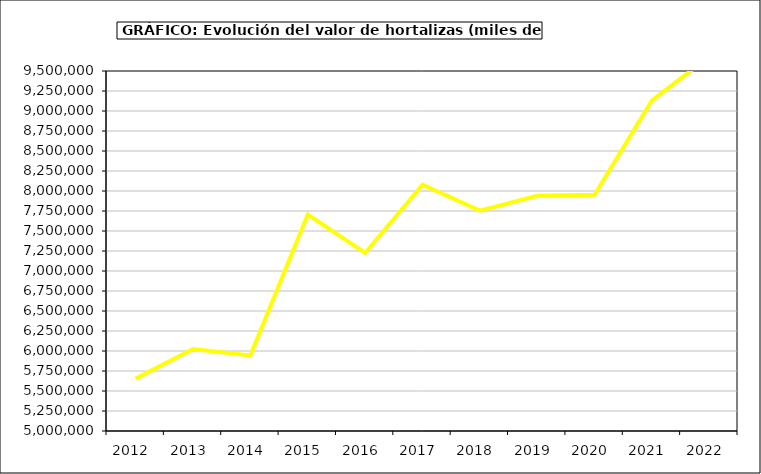
| Category | Valor |
|---|---|
| 2012.0 | 5654821.085 |
| 2013.0 | 6025736 |
| 2014.0 | 5945397.615 |
| 2015.0 | 7705933 |
| 2016.0 | 7225476.342 |
| 2017.0 | 8079271.573 |
| 2018.0 | 7753853.605 |
| 2019.0 | 7940649.854 |
| 2020.0 | 7953472.368 |
| 2021.0 | 9133515.743 |
| 2022.0 | 9678358.94 |